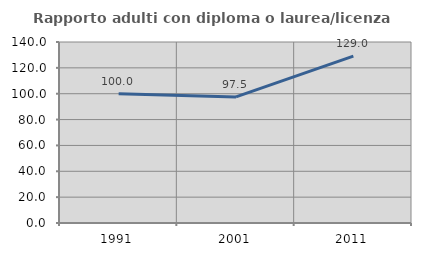
| Category | Rapporto adulti con diploma o laurea/licenza media  |
|---|---|
| 1991.0 | 100 |
| 2001.0 | 97.516 |
| 2011.0 | 129.032 |